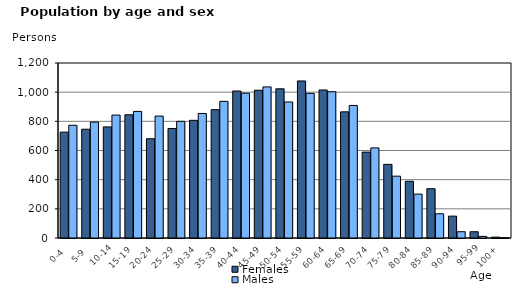
| Category | Females | Males |
|---|---|---|
|   0-4  | 726 | 773 |
|   5-9  | 746 | 795 |
| 10-14 | 762 | 843 |
| 15-19  | 845 | 868 |
| 20-24  | 681 | 836 |
| 25-29  | 751 | 800 |
| 30-34  | 807 | 854 |
| 35-39  | 880 | 937 |
| 40-44  | 1008 | 993 |
| 45-49  | 1013 | 1036 |
| 50-54  | 1023 | 933 |
| 55-59  | 1077 | 992 |
| 60-64  | 1015 | 1003 |
| 65-69  | 865 | 909 |
| 70-74  | 589 | 618 |
| 75-79  | 505 | 424 |
| 80-84  | 389 | 301 |
| 85-89  | 338 | 166 |
| 90-94  | 150 | 43 |
| 95-99 | 43 | 11 |
| 100+ | 6 | 1 |